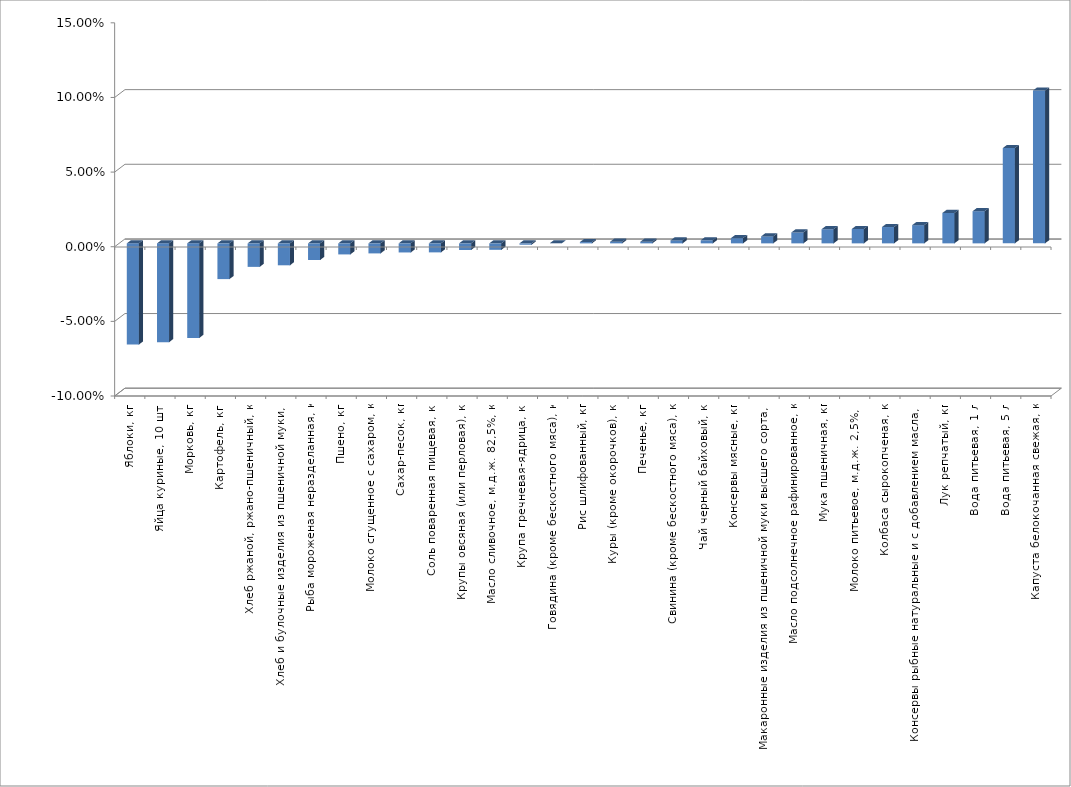
| Category | Series 0 |
|---|---|
| Яблоки, кг | -0.068 |
| Яйца куриные, 10 шт. | -0.066 |
| Морковь, кг | -0.063 |
| Картофель, кг | -0.024 |
| Хлеб ржаной, ржано-пшеничный, кг | -0.016 |
| Хлеб и булочные изделия из пшеничной муки, кг | -0.015 |
| Рыба мороженая неразделанная, кг | -0.011 |
| Пшено, кг | -0.007 |
| Молоко сгущенное с сахаром, кг | -0.007 |
| Сахар-песок, кг | -0.006 |
| Соль поваренная пищевая, кг | -0.006 |
| Крупы овсяная (или перловая), кг | -0.004 |
| Масло сливочное, м.д.ж. 82,5%, кг | -0.004 |
| Крупа гречневая-ядрица, кг | -0.001 |
| Говядина (кроме бескостного мяса), кг | 0 |
| Рис шлифованный, кг | 0.001 |
| Куры (кроме окорочков), кг | 0.001 |
| Печенье, кг | 0.001 |
| Свинина (кроме бескостного мяса), кг | 0.002 |
| Чай черный байховый, кг | 0.002 |
| Консервы мясные, кг | 0.004 |
| Макаронные изделия из пшеничной муки высшего сорта, кг | 0.005 |
| Масло подсолнечное рафинированное, кг | 0.007 |
| Мука пшеничная, кг | 0.009 |
| Молоко питьевое, м.д.ж. 2,5%, л | 0.01 |
| Колбаса сырокопченая, кг | 0.011 |
| Консервы рыбные натуральные и с добавлением масла, кг | 0.012 |
| Лук репчатый, кг | 0.02 |
| Вода питьевая, 1 л | 0.022 |
| Вода питьевая, 5 л | 0.064 |
| Капуста белокочанная свежая, кг | 0.102 |